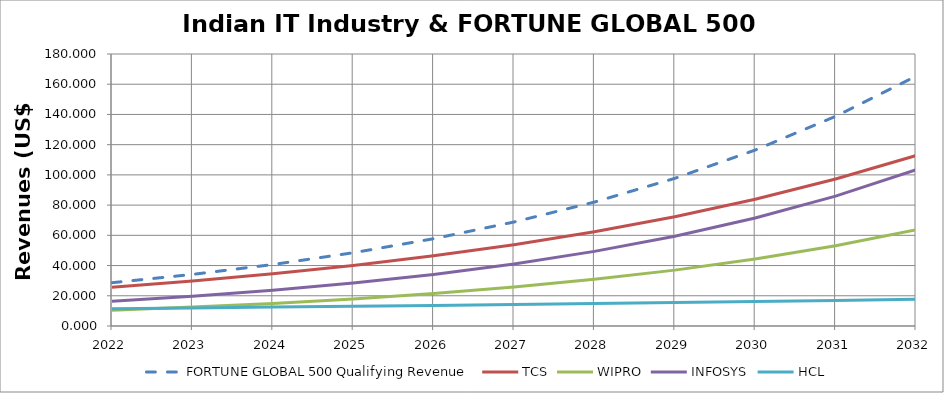
| Category | FORTUNE GLOBAL 500 Qualifying Revenue | TCS | WIPRO | INFOSYS | HCL |
|---|---|---|---|---|---|
| 2022.0 | 28.649 | 25.707 | 10.425 | 16.311 | 11.485 |
| 2023.0 | 34.137 | 29.803 | 12.492 | 19.619 | 11.991 |
| 2024.0 | 40.677 | 34.551 | 14.969 | 23.597 | 12.52 |
| 2025.0 | 48.47 | 40.057 | 17.937 | 28.382 | 13.072 |
| 2026.0 | 57.755 | 46.439 | 21.493 | 34.138 | 13.648 |
| 2027.0 | 68.82 | 53.838 | 25.755 | 41.061 | 14.25 |
| 2028.0 | 82.004 | 62.416 | 30.861 | 49.387 | 14.879 |
| 2029.0 | 97.714 | 72.361 | 36.981 | 59.402 | 15.535 |
| 2030.0 | 116.433 | 83.89 | 44.313 | 71.448 | 16.22 |
| 2031.0 | 138.738 | 97.256 | 53.099 | 85.937 | 16.935 |
| 2032.0 | 165.317 | 112.752 | 63.627 | 103.364 | 17.681 |